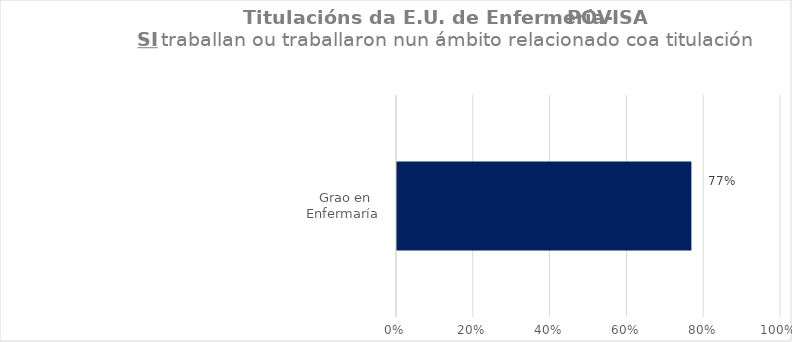
| Category | Series 1 |
|---|---|
| Grao en Enfermaría  | 0.769 |